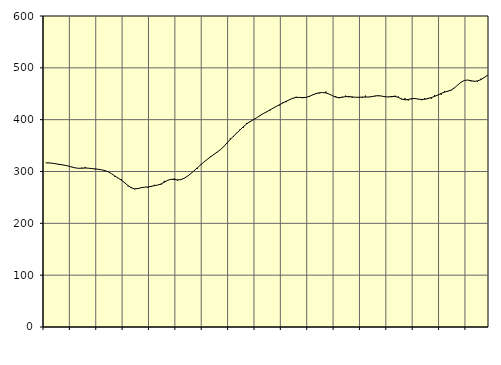
| Category | Piggar | Series 1 |
|---|---|---|
| nan | 316.8 | 316.72 |
| 87.0 | 316.8 | 316.53 |
| 87.0 | 316.2 | 315.98 |
| 87.0 | 314.6 | 314.95 |
| nan | 312.8 | 313.84 |
| 88.0 | 313.3 | 312.93 |
| 88.0 | 311.3 | 311.8 |
| 88.0 | 309.8 | 310.27 |
| nan | 308.3 | 308.58 |
| 89.0 | 307 | 306.98 |
| 89.0 | 306.1 | 306.17 |
| 89.0 | 307.3 | 306.36 |
| nan | 308.8 | 306.72 |
| 90.0 | 306.2 | 306.39 |
| 90.0 | 306.2 | 305.62 |
| 90.0 | 304.2 | 305.03 |
| nan | 303.8 | 304.3 |
| 91.0 | 303.2 | 303.17 |
| 91.0 | 300.7 | 301.68 |
| 91.0 | 299 | 299.39 |
| nan | 295.6 | 295.65 |
| 92.0 | 289.9 | 291.29 |
| 92.0 | 286.9 | 287.36 |
| 92.0 | 285.6 | 283.18 |
| nan | 277.7 | 278.16 |
| 93.0 | 271.5 | 272.77 |
| 93.0 | 270 | 268.54 |
| 93.0 | 265.5 | 266.58 |
| nan | 268.1 | 267.08 |
| 94.0 | 269.5 | 268.77 |
| 94.0 | 269.6 | 269.73 |
| 94.0 | 268.9 | 270.16 |
| nan | 270 | 271.27 |
| 95.0 | 274.3 | 272.68 |
| 95.0 | 273.8 | 273.87 |
| 95.0 | 274.6 | 275.93 |
| nan | 282 | 279.39 |
| 96.0 | 282.6 | 283.01 |
| 96.0 | 284.8 | 284.93 |
| 96.0 | 286.6 | 284.69 |
| nan | 282.5 | 283.81 |
| 97.0 | 283.7 | 284.23 |
| 97.0 | 286.5 | 286.82 |
| 97.0 | 291.2 | 290.93 |
| nan | 295.5 | 295.74 |
| 98.0 | 301.3 | 301.21 |
| 98.0 | 305.2 | 307.01 |
| 98.0 | 313 | 312.55 |
| nan | 318.2 | 318.17 |
| 99.0 | 323.2 | 323.27 |
| 99.0 | 329.6 | 328.18 |
| 99.0 | 332.1 | 332.84 |
| nan | 337.7 | 337.21 |
| 0.0 | 341.6 | 341.88 |
| 0.0 | 347.3 | 347.82 |
| 0.0 | 354.3 | 354.96 |
| nan | 363.7 | 361.92 |
| 1.0 | 366.6 | 368.26 |
| 1.0 | 374.7 | 374.25 |
| 1.0 | 381.8 | 380.38 |
| nan | 384.4 | 386.51 |
| 2.0 | 393.8 | 391.87 |
| 2.0 | 395.3 | 396.23 |
| 2.0 | 400.2 | 399.83 |
| nan | 403.6 | 403.53 |
| 3.0 | 408.6 | 407.81 |
| 3.0 | 412 | 411.72 |
| 3.0 | 414.5 | 415.12 |
| nan | 417.4 | 418.61 |
| 4.0 | 422.1 | 422.15 |
| 4.0 | 426.1 | 425.73 |
| 4.0 | 427.5 | 429 |
| nan | 433.8 | 432.35 |
| 5.0 | 433.7 | 435.51 |
| 5.0 | 439.1 | 438.56 |
| 5.0 | 441.9 | 441.36 |
| nan | 444.2 | 442.88 |
| 6.0 | 442.5 | 442.99 |
| 6.0 | 441.5 | 442.63 |
| 6.0 | 443.4 | 443.09 |
| nan | 443.7 | 445.03 |
| 7.0 | 448.2 | 447.77 |
| 7.0 | 450.9 | 450.28 |
| 7.0 | 450.7 | 451.83 |
| nan | 452.6 | 452.34 |
| 8.0 | 454.3 | 451.61 |
| 8.0 | 449.3 | 449.44 |
| 8.0 | 446.1 | 446.32 |
| nan | 445 | 443.59 |
| 9.0 | 441.3 | 442.43 |
| 9.0 | 444.3 | 443.25 |
| 9.0 | 446.4 | 444.39 |
| nan | 443.2 | 444.52 |
| 10.0 | 442.3 | 443.89 |
| 10.0 | 443.4 | 443.25 |
| 10.0 | 442.5 | 443.17 |
| nan | 442.1 | 443.52 |
| 11.0 | 446.4 | 443.63 |
| 11.0 | 443.4 | 443.76 |
| 11.0 | 444.4 | 444.53 |
| nan | 445.1 | 445.8 |
| 12.0 | 445.3 | 446.33 |
| 12.0 | 445.3 | 445.43 |
| 12.0 | 444 | 444.23 |
| nan | 443.4 | 443.92 |
| 13.0 | 443.2 | 444.71 |
| 13.0 | 446.3 | 444.89 |
| 13.0 | 444.6 | 442.98 |
| nan | 439.1 | 439.94 |
| 14.0 | 441.6 | 438.26 |
| 14.0 | 437 | 439 |
| 14.0 | 439.3 | 440.53 |
| nan | 441.8 | 440.83 |
| 15.0 | 439.4 | 439.71 |
| 15.0 | 437.5 | 438.92 |
| 15.0 | 441.4 | 439.38 |
| nan | 442 | 440.69 |
| 16.0 | 440.4 | 442.65 |
| 16.0 | 447.4 | 444.86 |
| 16.0 | 447 | 447.53 |
| nan | 447.9 | 450.6 |
| 17.0 | 455.4 | 453.16 |
| 17.0 | 454.2 | 454.97 |
| 17.0 | 456.2 | 457.03 |
| nan | 461.8 | 461.15 |
| 18.0 | 466.5 | 466.87 |
| 18.0 | 472.4 | 472.17 |
| 18.0 | 475.9 | 475.62 |
| nan | 476.6 | 476.44 |
| 19.0 | 474 | 475.2 |
| 19.0 | 473.5 | 474.04 |
| 19.0 | 472.7 | 474.71 |
| nan | 478.9 | 477.14 |
| 20.0 | 480.8 | 481 |
| 20.0 | 486.3 | 485.37 |